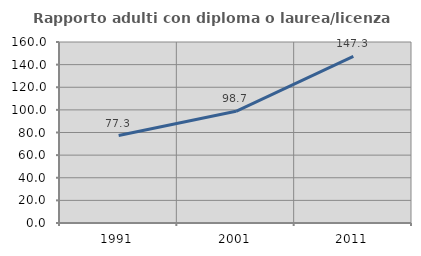
| Category | Rapporto adulti con diploma o laurea/licenza media  |
|---|---|
| 1991.0 | 77.32 |
| 2001.0 | 98.73 |
| 2011.0 | 147.324 |